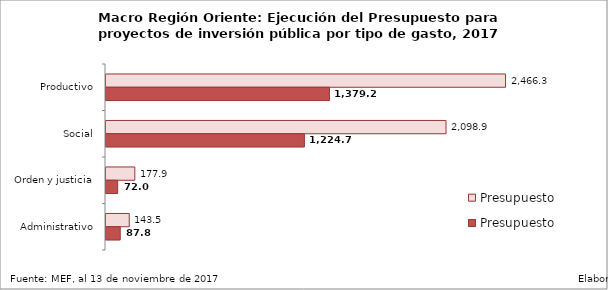
| Category | Presupuesto | Presupuesto Ejecutado |
|---|---|---|
| Productivo | 2466.319 | 1379.237 |
| Social | 2098.857 | 1224.699 |
| Orden y justicia | 177.93 | 71.988 |
| Administrativo | 143.5 | 87.85 |